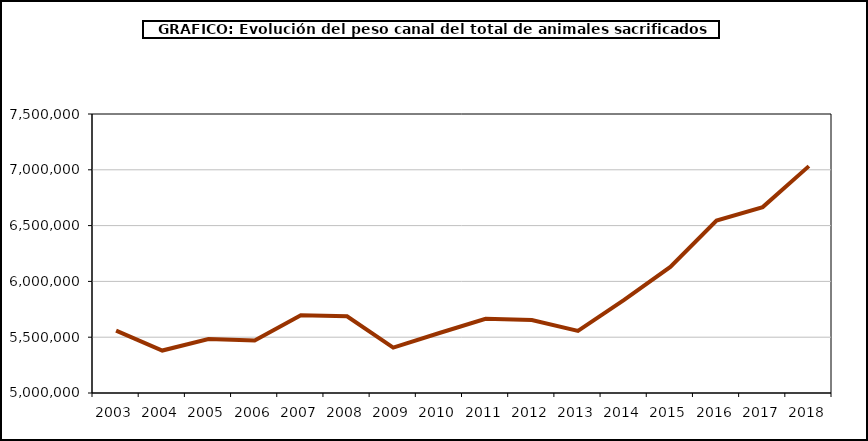
| Category | Series 0 |
|---|---|
| 2003.0 | 5559491.635 |
| 2004.0 | 5380320.91 |
| 2005.0 | 5484133.682 |
| 2006.0 | 5469928.516 |
| 2007.0 | 5697170.115 |
| 2008.0 | 5687912.363 |
| 2009.0 | 5406476.675 |
| 2010.0 | 5537415.454 |
| 2011.0 | 5664197.217 |
| 2012.0 | 5653769.803 |
| 2013.0 | 5556795.031 |
| 2014.0 | 5833789.68 |
| 2015.0 | 6129137.234 |
| 2016.0 | 6544369.423 |
| 2017.0 | 6665614.034 |
| 2018.0 | 7032931.593 |